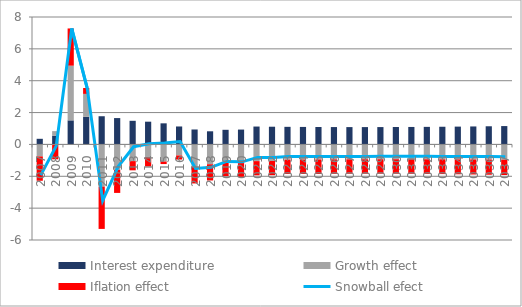
| Category | Interest expenditure | Growth effect | Iflation effect |
|---|---|---|---|
| 0 | 0.353 | -0.754 | -1.527 |
| 1 | 0.551 | 0.285 | -0.933 |
| 2 | 1.511 | 3.434 | 2.337 |
| 3 | 1.731 | 1.442 | 0.368 |
| 4 | 1.77 | -2.65 | -2.655 |
| 5 | 1.655 | -1.594 | -1.45 |
| 6 | 1.483 | -1.047 | -0.579 |
| 7 | 1.428 | -0.798 | -0.585 |
| 8 | 1.324 | -1.075 | -0.157 |
| 9 | 1.127 | -0.694 | -0.255 |
| 10 | 0.938 | -1.39 | -1.06 |
| 11 | 0.825 | -1.245 | -1.018 |
| 12 | 0.918 | -1.135 | -0.853 |
| 13 | 0.933 | -1.17 | -0.858 |
| 14 | 1.123 | -1.048 | -0.89 |
| 15 | 1.112 | -1.038 | -0.893 |
| 16 | 1.105 | -0.957 | -0.898 |
| 17 | 1.098 | -0.952 | -0.904 |
| 18 | 1.093 | -0.945 | -0.911 |
| 19 | 1.09 | -0.939 | -0.908 |
| 20 | 1.088 | -0.935 | -0.907 |
| 21 | 1.088 | -0.932 | -0.907 |
| 22 | 1.09 | -0.93 | -0.908 |
| 23 | 1.093 | -0.93 | -0.911 |
| 24 | 1.097 | -0.931 | -0.914 |
| 25 | 1.103 | -0.933 | -0.919 |
| 26 | 1.11 | -0.936 | -0.925 |
| 27 | 1.119 | -0.941 | -0.932 |
| 28 | 1.129 | -0.946 | -0.94 |
| 29 | 1.14 | -0.953 | -0.95 |
| 30 | 1.152 | -0.96 | -0.96 |